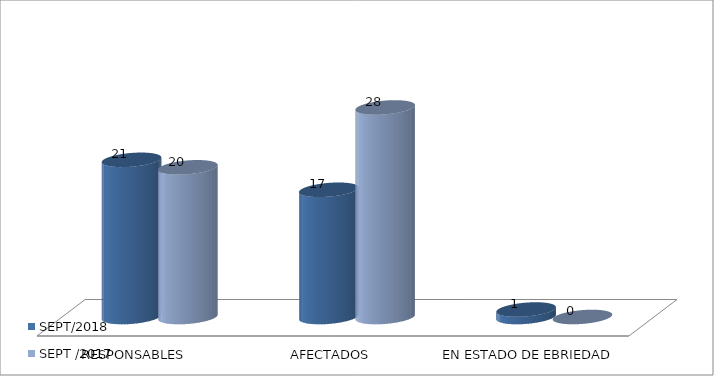
| Category | SEPT/2018 | SEPT /2017 |
|---|---|---|
| RESPONSABLES | 21 | 20 |
| AFECTADOS | 17 | 28 |
| EN ESTADO DE EBRIEDAD | 1 | 0 |